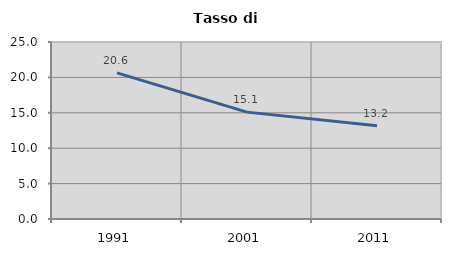
| Category | Tasso di disoccupazione   |
|---|---|
| 1991.0 | 20.635 |
| 2001.0 | 15.094 |
| 2011.0 | 13.158 |